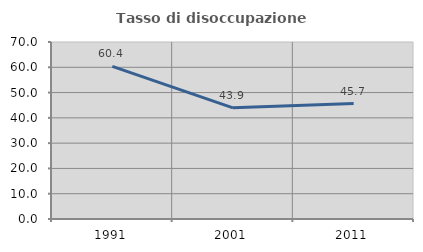
| Category | Tasso di disoccupazione giovanile  |
|---|---|
| 1991.0 | 60.358 |
| 2001.0 | 43.949 |
| 2011.0 | 45.669 |